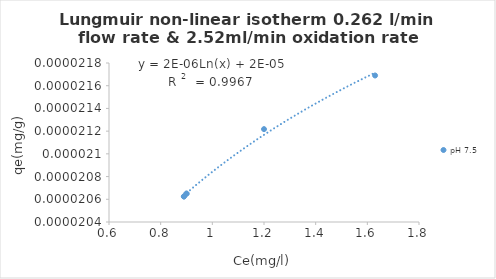
| Category | pH 7.5 |
|---|---|
| 1.63 | 0 |
| 1.2 | 0 |
| 0.89 | 0 |
| 0.9 | 0 |
| 0.9 | 0 |
| 0.89 | 0 |